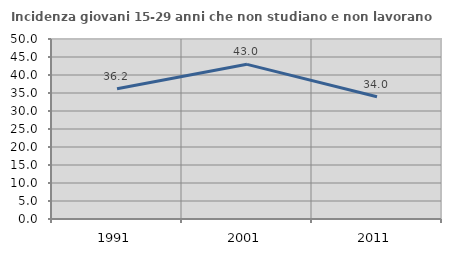
| Category | Incidenza giovani 15-29 anni che non studiano e non lavorano  |
|---|---|
| 1991.0 | 36.166 |
| 2001.0 | 42.961 |
| 2011.0 | 33.97 |